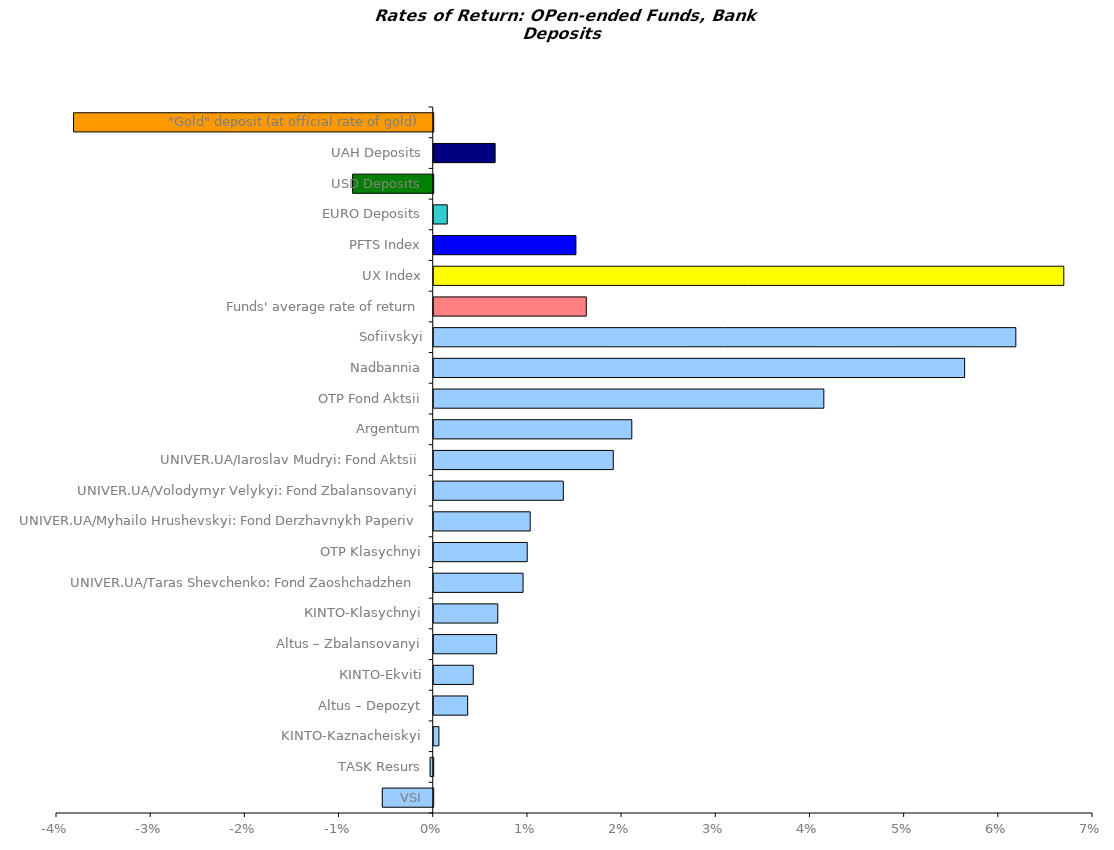
| Category | Series 0 |
|---|---|
| VSI | -0.005 |
| ТАSK Resurs | 0 |
| KINTO-Kaznacheiskyi | 0.001 |
| Altus – Depozyt | 0.004 |
| КІNTO-Ekviti | 0.004 |
| Altus – Zbalansovanyi | 0.007 |
| КІNТО-Klasychnyi | 0.007 |
| UNIVER.UA/Taras Shevchenko: Fond Zaoshchadzhen | 0.009 |
| OTP Klasychnyi | 0.01 |
| UNIVER.UA/Myhailo Hrushevskyi: Fond Derzhavnykh Paperiv | 0.01 |
| UNIVER.UA/Volodymyr Velykyi: Fond Zbalansovanyi | 0.014 |
| UNIVER.UA/Iaroslav Mudryi: Fond Aktsii | 0.019 |
| Argentum | 0.021 |
| OTP Fond Aktsii | 0.041 |
| Nadbannia | 0.056 |
| Sofiivskyi | 0.062 |
| Funds' average rate of return | 0.016 |
| UX Index | 0.067 |
| PFTS Index | 0.015 |
| EURO Deposits | 0.001 |
| USD Deposits | -0.009 |
| UAH Deposits | 0.007 |
| "Gold" deposit (at official rate of gold) | -0.038 |